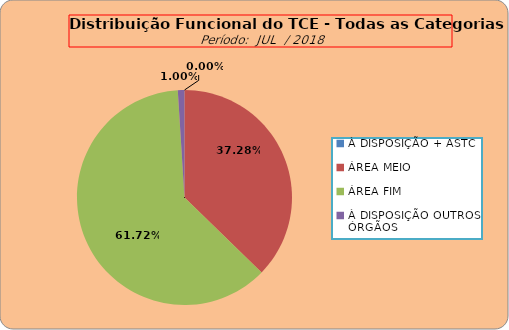
| Category | Series 0 |
|---|---|
| À DISPOSIÇÃO + ASTC | 0 |
| ÁREA MEIO | 186 |
| ÁREA FIM | 308 |
| À DISPOSIÇÃO OUTROS ÓRGÃOS | 5 |